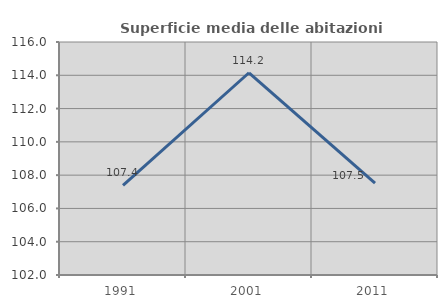
| Category | Superficie media delle abitazioni occupate |
|---|---|
| 1991.0 | 107.38 |
| 2001.0 | 114.152 |
| 2011.0 | 107.517 |